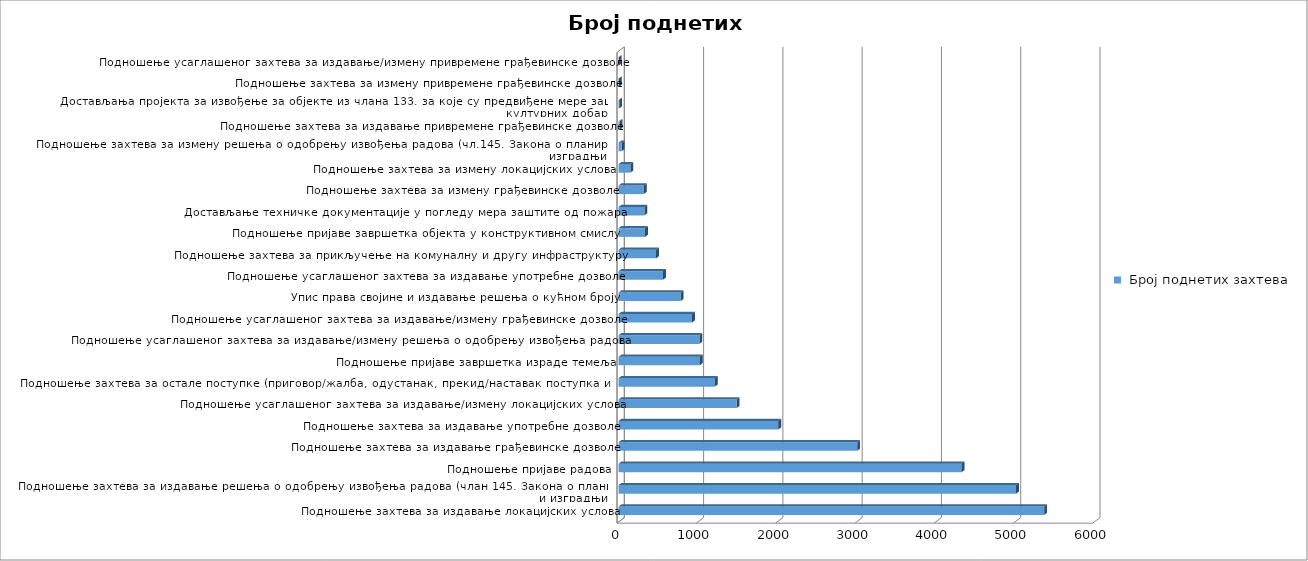
| Category |  Број поднетих захтева |
|---|---|
| Подношење захтева за издавање локацијских услова | 5369 |
| Подношење захтева за издавање решења о одобрењу извођења радова (члан 145. Закона о планирању и изградњи) | 5014 |
| Подношење пријаве радова | 4327 |
| Подношење захтева за издавање грађевинске дозволе | 3010 |
| Подношење захтева за издавање употребне дозволе | 2016 |
| Подношење усаглашеног захтева за издавање/измену локацијских услова | 1490 |
| Подношење захтева за остале поступке (приговор/жалба, одустанак, прекид/наставак поступка и сл.) | 1214 |
| Подношење пријаве завршетка израде темеља | 1025 |
| Подношење усаглашеног захтева за издавање/измену решења о одобрењу извођења радова  | 1020 |
| Подношење усаглашеног захтева за издавање/измену грађевинске дозволе | 928 |
| Упис права својине и издавање решења о кућном броју | 784 |
| Подношење усаглашеног захтева за издавање употребне дозволе | 561 |
| Подношење захтева за прикључење на комуналну и другу инфраструктуру | 474 |
| Подношење пријаве завршетка објекта у конструктивном смислу | 335 |
| Достављање техничке документације у погледу мера заштите од пожара | 326 |
| Подношење захтева за измену грађевинске дозволе | 318 |
| Подношење захтева за измену локацијских услова  | 150 |
| Подношење захтева за измену решења о одобрењу извођења радова (чл.145. Закона о планирању и изградњи) | 39 |
| Подношење захтева за издавање привремене грађевинске дозволе | 14 |
| Достављања пројекта за извођење за објекте из члана 133. за које су предвиђене мере заштите културних добара | 8 |
| Подношење захтева за измену привремене грађевинске дозволе | 3 |
| Подношење усаглашеног захтева за издавање/измену привремене грађевинске дозволе | 2 |